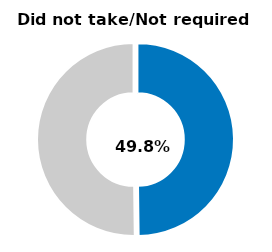
| Category | Series 0 |
|---|---|
| Did not take/not required | 0.498 |
| Other | 0.502 |